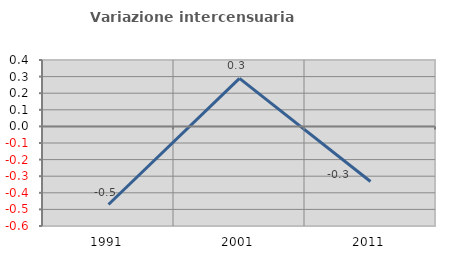
| Category | Variazione intercensuaria annua |
|---|---|
| 1991.0 | -0.471 |
| 2001.0 | 0.289 |
| 2011.0 | -0.332 |